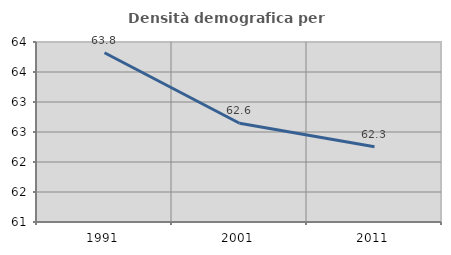
| Category | Densità demografica |
|---|---|
| 1991.0 | 63.821 |
| 2001.0 | 62.646 |
| 2011.0 | 62.254 |